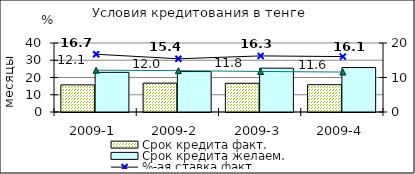
| Category | Срок кредита факт.  | Срок кредита желаем. |
|---|---|---|
| 2009-1 | 15.72 | 22.99 |
| 2009-2 | 16.73 | 23.45 |
| 2009-3 | 16.66 | 25.4 |
| 2009-4 | 15.84 | 25.78 |